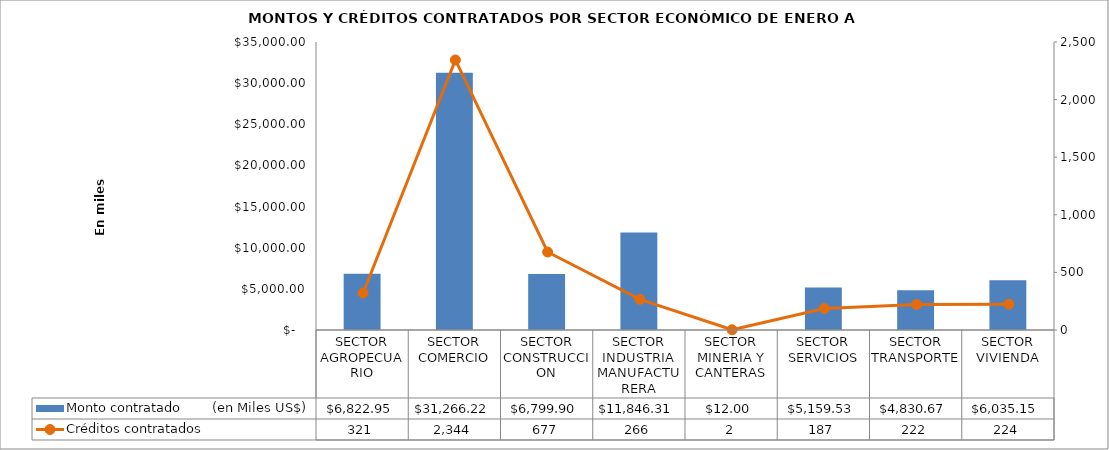
| Category | Monto contratado        (en Miles US$) |
|---|---|
| SECTOR AGROPECUARIO | 6822.95 |
| SECTOR COMERCIO | 31266.222 |
| SECTOR CONSTRUCCION | 6799.905 |
| SECTOR INDUSTRIA MANUFACTURERA | 11846.307 |
| SECTOR MINERIA Y CANTERAS | 12 |
| SECTOR SERVICIOS | 5159.533 |
| SECTOR TRANSPORTE | 4830.67 |
| SECTOR VIVIENDA | 6035.147 |